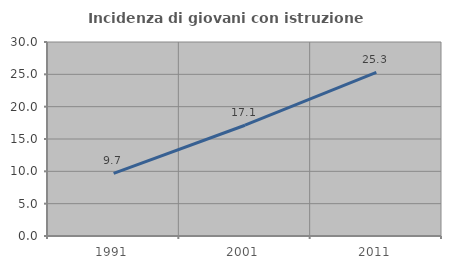
| Category | Incidenza di giovani con istruzione universitaria |
|---|---|
| 1991.0 | 9.681 |
| 2001.0 | 17.131 |
| 2011.0 | 25.301 |